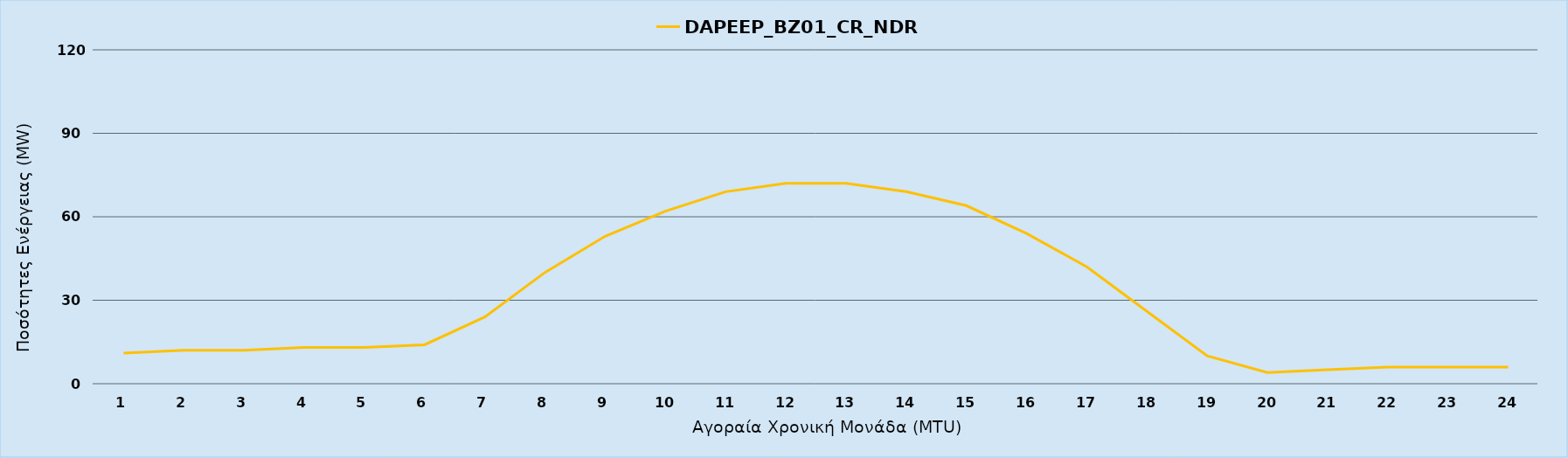
| Category | DAPEEP_BZ01_CR_NDR |
|---|---|
| 0 | 11 |
| 1 | 12 |
| 2 | 12 |
| 3 | 13 |
| 4 | 13 |
| 5 | 14 |
| 6 | 24 |
| 7 | 40 |
| 8 | 53 |
| 9 | 62 |
| 10 | 69 |
| 11 | 72 |
| 12 | 72 |
| 13 | 69 |
| 14 | 64 |
| 15 | 54 |
| 16 | 42 |
| 17 | 26 |
| 18 | 10 |
| 19 | 4 |
| 20 | 5 |
| 21 | 6 |
| 22 | 6 |
| 23 | 6 |